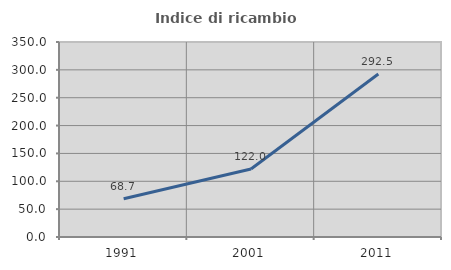
| Category | Indice di ricambio occupazionale  |
|---|---|
| 1991.0 | 68.696 |
| 2001.0 | 121.951 |
| 2011.0 | 292.453 |